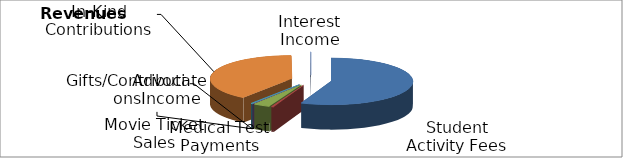
| Category | Series 0 |
|---|---|
| _x0015_Student Activity Fees | 370240 |
| _x0015_Medical Test Payments | 3000 |
| _x0012_Movie Ticket Sales | 22000 |
| _x000f_Advocate Income | 250 |
| _x0013_Gifts/Contributions | 2000 |
| _x0015_In-Kind Contributions | 263903 |
| _x000f_Interest Income | 835 |